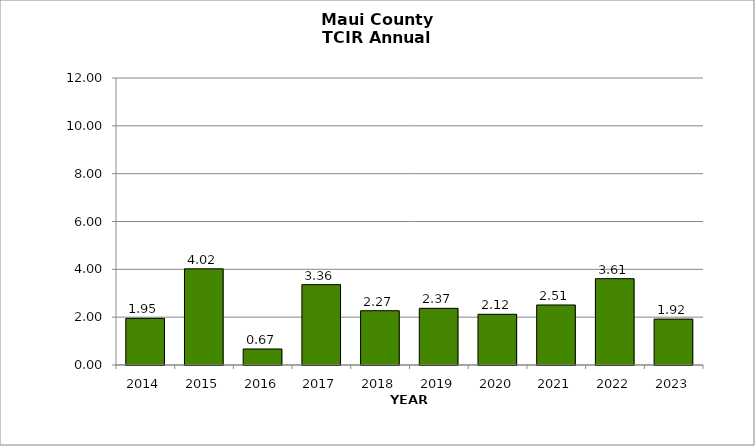
| Category | Maui County |
|---|---|
| 2014.0 | 1.95 |
| 2015.0 | 4.02 |
| 2016.0 | 0.67 |
| 2017.0 | 3.36 |
| 2018.0 | 2.27 |
| 2019.0 | 2.37 |
| 2020.0 | 2.12 |
| 2021.0 | 2.51 |
| 2022.0 | 3.61 |
| 2023.0 | 1.92 |